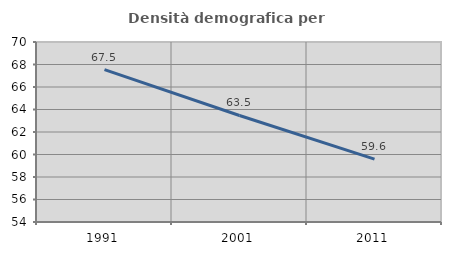
| Category | Densità demografica |
|---|---|
| 1991.0 | 67.541 |
| 2001.0 | 63.468 |
| 2011.0 | 59.592 |